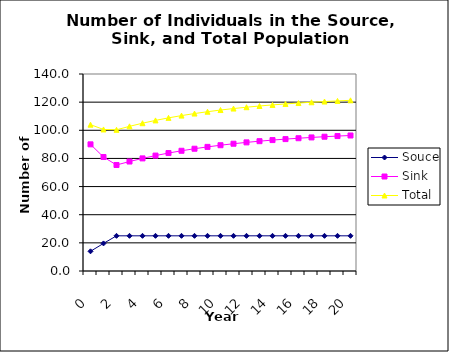
| Category | Souce | Sink | Total |
|---|---|---|---|
| 0.0 | 14 | 90 | 104 |
| 1.0 | 19.6 | 81 | 100.6 |
| 2.0 | 25 | 75.34 | 100.34 |
| 3.0 | 25 | 77.806 | 102.806 |
| 4.0 | 25 | 80.025 | 105.025 |
| 5.0 | 25 | 82.023 | 107.023 |
| 6.0 | 25 | 83.821 | 108.821 |
| 7.0 | 25 | 85.439 | 110.439 |
| 8.0 | 25 | 86.895 | 111.895 |
| 9.0 | 25 | 88.205 | 113.205 |
| 10.0 | 25 | 89.385 | 114.385 |
| 11.0 | 25 | 90.446 | 115.446 |
| 12.0 | 25 | 91.402 | 116.402 |
| 13.0 | 25 | 92.261 | 117.261 |
| 14.0 | 25 | 93.035 | 118.035 |
| 15.0 | 25 | 93.732 | 118.732 |
| 16.0 | 25 | 94.359 | 119.359 |
| 17.0 | 25 | 94.923 | 119.923 |
| 18.0 | 25 | 95.43 | 120.43 |
| 19.0 | 25 | 95.887 | 120.887 |
| 20.0 | 25 | 96.299 | 121.299 |